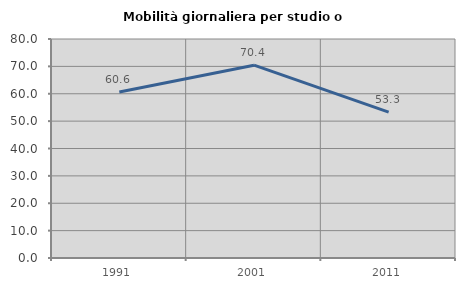
| Category | Mobilità giornaliera per studio o lavoro |
|---|---|
| 1991.0 | 60.639 |
| 2001.0 | 70.437 |
| 2011.0 | 53.29 |